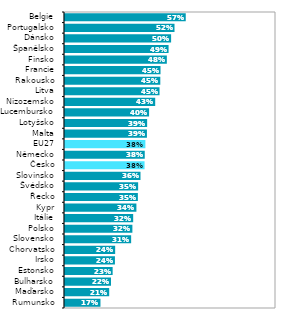
| Category | Series 0 |
|---|---|
| Rumunsko | 0.168 |
| Maďarsko | 0.209 |
| Bulharsko | 0.218 |
| Estonsko | 0.226 |
| Irsko | 0.237 |
| Chorvatsko | 0.238 |
| Slovensko | 0.313 |
| Polsko | 0.319 |
| Itálie | 0.323 |
| Kypr | 0.338 |
| Řecko | 0.345 |
| Švédsko | 0.347 |
| Slovinsko | 0.358 |
| Česko | 0.377 |
| Německo | 0.378 |
| EU27 | 0.381 |
| Malta | 0.388 |
| Lotyšsko | 0.389 |
| Lucembursko | 0.398 |
| Nizozemsko | 0.427 |
| Litva | 0.448 |
| Rakousko | 0.452 |
| Francie | 0.453 |
| Finsko | 0.483 |
| Španělsko | 0.491 |
| Dánsko | 0.503 |
| Portugalsko | 0.519 |
| Belgie | 0.572 |